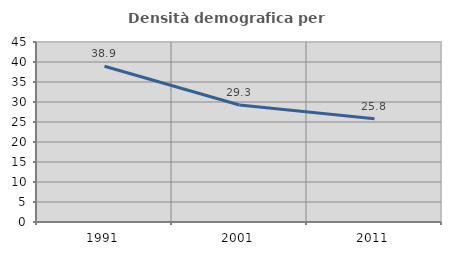
| Category | Densità demografica |
|---|---|
| 1991.0 | 38.922 |
| 2001.0 | 29.257 |
| 2011.0 | 25.822 |